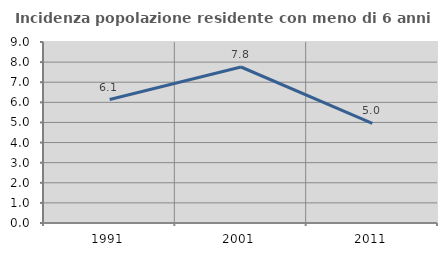
| Category | Incidenza popolazione residente con meno di 6 anni |
|---|---|
| 1991.0 | 6.14 |
| 2001.0 | 7.757 |
| 2011.0 | 4.959 |